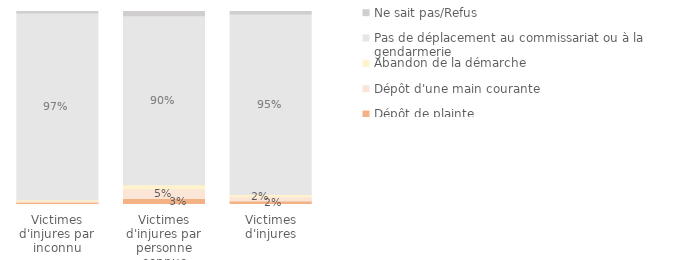
| Category | Dépôt de plainte | Dépôt d'une main courante | Abandon de la démarche | Pas de déplacement au commissariat ou à la gendarmerie | Ne sait pas/Refus |
|---|---|---|---|---|---|
| Victimes d'injures par inconnu | 0.011 | 0.008 | 0.006 | 0.973 | 0.008 |
| Victimes d'injures par personne connue | 0.032 | 0.05 | 0.022 | 0.895 | 0.023 |
| Victimes d'injures | 0.018 | 0.022 | 0.012 | 0.946 | 0.013 |